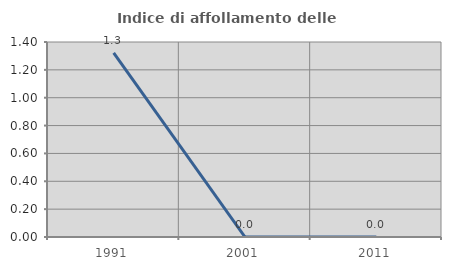
| Category | Indice di affollamento delle abitazioni  |
|---|---|
| 1991.0 | 1.322 |
| 2001.0 | 0 |
| 2011.0 | 0 |